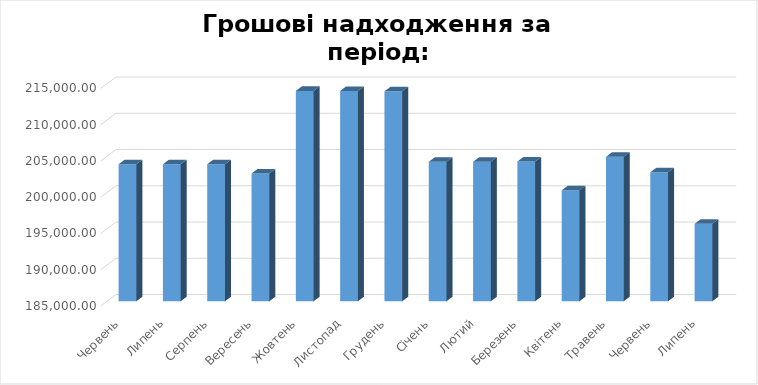
| Category | Series 0 |
|---|---|
| Червень | 203901.11 |
| Липень | 203901.11 |
| Серпень | 203901.11 |
| Вересень | 202625.46 |
| Жовтень | 214010.79 |
| Листопад | 214000.79 |
| Грудень | 213950.55 |
| Січень | 204235.35 |
| Лютий | 204235.35 |
| Березень | 204276.25 |
| Квітень | 200297.22 |
| Травень | 204917.22 |
| Червень | 202787.22 |
| Липень | 195689.72 |